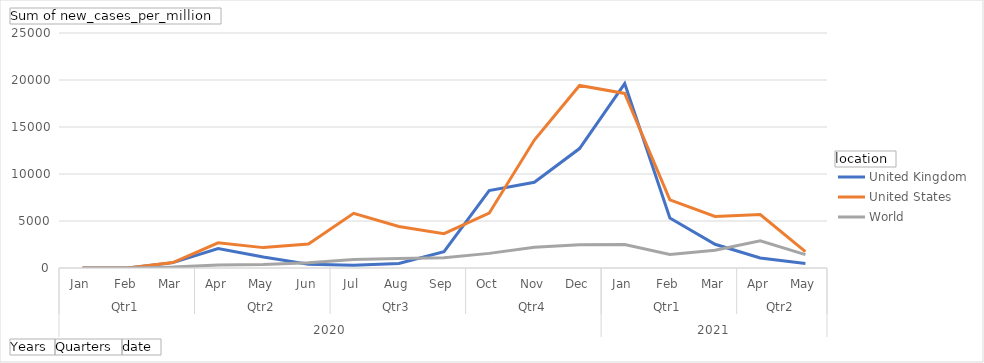
| Category | United Kingdom | United States | World |
|---|---|---|---|
| 0 | 0.029 | 0.021 | 1.203 |
| 1 | 0.871 | 0.051 | 9.761 |
| 2 | 570.869 | 580.888 | 101.322 |
| 3 | 2061.636 | 2684.929 | 308.418 |
| 4 | 1160.3 | 2168.256 | 373.112 |
| 5 | 407.699 | 2548.185 | 547.768 |
| 6 | 288.381 | 5816.407 | 916.875 |
| 7 | 490.382 | 4409.255 | 1014.052 |
| 8 | 1734.747 | 3651.125 | 1090.809 |
| 9 | 8233.611 | 5831.345 | 1556.231 |
| 10 | 9117.361 | 13609.298 | 2215.384 |
| 11 | 12705.107 | 19422.898 | 2479.302 |
| 12 | 19620.42 | 18572.935 | 2497.529 |
| 13 | 5312.434 | 7255.808 | 1430.747 |
| 14 | 2521.212 | 5478.704 | 1888.174 |
| 15 | 1064.488 | 5694.095 | 2886.77 |
| 16 | 477.52 | 1743.222 | 1426.881 |